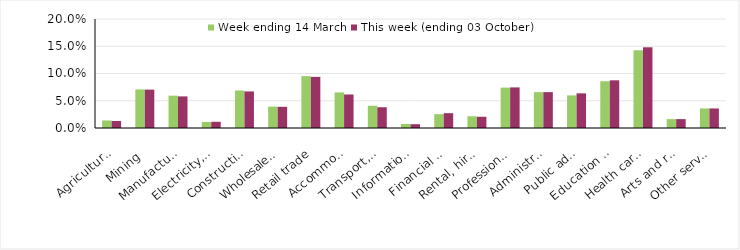
| Category | Week ending 14 March | This week (ending 03 October) |
|---|---|---|
| Agriculture, forestry and fishing | 0.014 | 0.013 |
| Mining | 0.071 | 0.07 |
| Manufacturing | 0.059 | 0.058 |
| Electricity, gas, water and waste services | 0.011 | 0.011 |
| Construction | 0.069 | 0.067 |
| Wholesale trade | 0.039 | 0.039 |
| Retail trade | 0.095 | 0.094 |
| Accommodation and food services | 0.065 | 0.062 |
| Transport, postal and warehousing | 0.041 | 0.038 |
| Information media and telecommunications | 0.007 | 0.007 |
| Financial and insurance services | 0.025 | 0.027 |
| Rental, hiring and real estate services | 0.022 | 0.021 |
| Professional, scientific and technical services | 0.074 | 0.074 |
| Administrative and support services | 0.066 | 0.066 |
| Public administration and safety | 0.06 | 0.064 |
| Education and training | 0.086 | 0.088 |
| Health care and social assistance | 0.143 | 0.148 |
| Arts and recreation services | 0.016 | 0.016 |
| Other services | 0.036 | 0.036 |